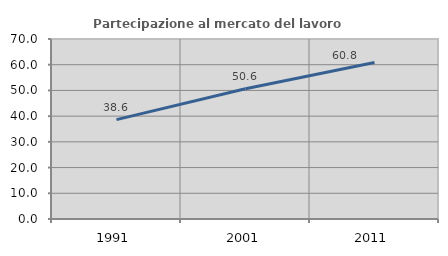
| Category | Partecipazione al mercato del lavoro  femminile |
|---|---|
| 1991.0 | 38.646 |
| 2001.0 | 50.647 |
| 2011.0 | 60.848 |